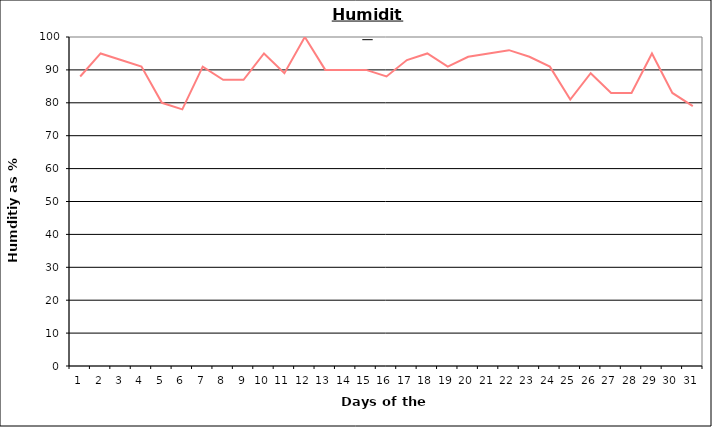
| Category | Series 0 |
|---|---|
| 0 | 88 |
| 1 | 95 |
| 2 | 93 |
| 3 | 91 |
| 4 | 80 |
| 5 | 78 |
| 6 | 91 |
| 7 | 87 |
| 8 | 87 |
| 9 | 95 |
| 10 | 89 |
| 11 | 100 |
| 12 | 90 |
| 13 | 90 |
| 14 | 90 |
| 15 | 88 |
| 16 | 93 |
| 17 | 95 |
| 18 | 91 |
| 19 | 94 |
| 20 | 95 |
| 21 | 96 |
| 22 | 94 |
| 23 | 91 |
| 24 | 81 |
| 25 | 89 |
| 26 | 83 |
| 27 | 83 |
| 28 | 95 |
| 29 | 83 |
| 30 | 79 |